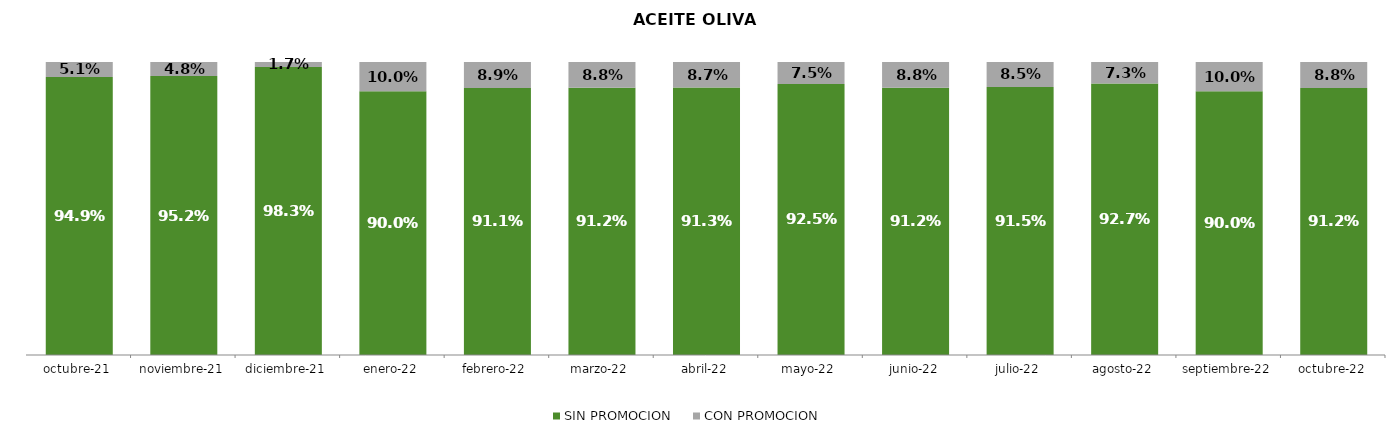
| Category | SIN PROMOCION   | CON PROMOCION   |
|---|---|---|
| 2021-10-01 | 0.949 | 0.051 |
| 2021-11-01 | 0.952 | 0.048 |
| 2021-12-01 | 0.983 | 0.017 |
| 2022-01-01 | 0.9 | 0.1 |
| 2022-02-01 | 0.911 | 0.089 |
| 2022-03-01 | 0.912 | 0.088 |
| 2022-04-01 | 0.913 | 0.087 |
| 2022-05-01 | 0.925 | 0.075 |
| 2022-06-01 | 0.912 | 0.088 |
| 2022-07-01 | 0.915 | 0.085 |
| 2022-08-01 | 0.927 | 0.073 |
| 2022-09-01 | 0.9 | 0.1 |
| 2022-10-01 | 0.912 | 0.088 |